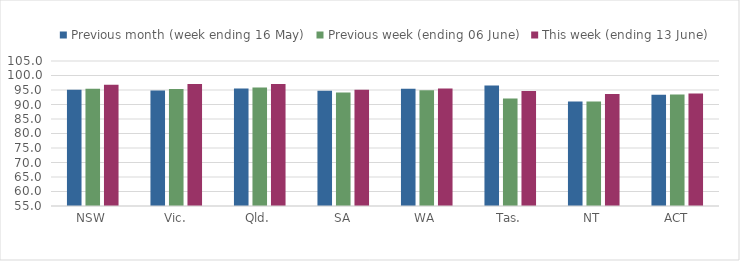
| Category | Previous month (week ending 16 May) | Previous week (ending 06 June) | This week (ending 13 June) |
|---|---|---|---|
| NSW | 95.117 | 95.469 | 96.809 |
| Vic. | 94.859 | 95.308 | 97.068 |
| Qld. | 95.483 | 95.858 | 97.076 |
| SA | 94.735 | 94.167 | 95.087 |
| WA | 95.446 | 94.9 | 95.535 |
| Tas. | 96.542 | 92.11 | 94.682 |
| NT | 91.018 | 91.018 | 93.639 |
| ACT | 93.371 | 93.418 | 93.752 |